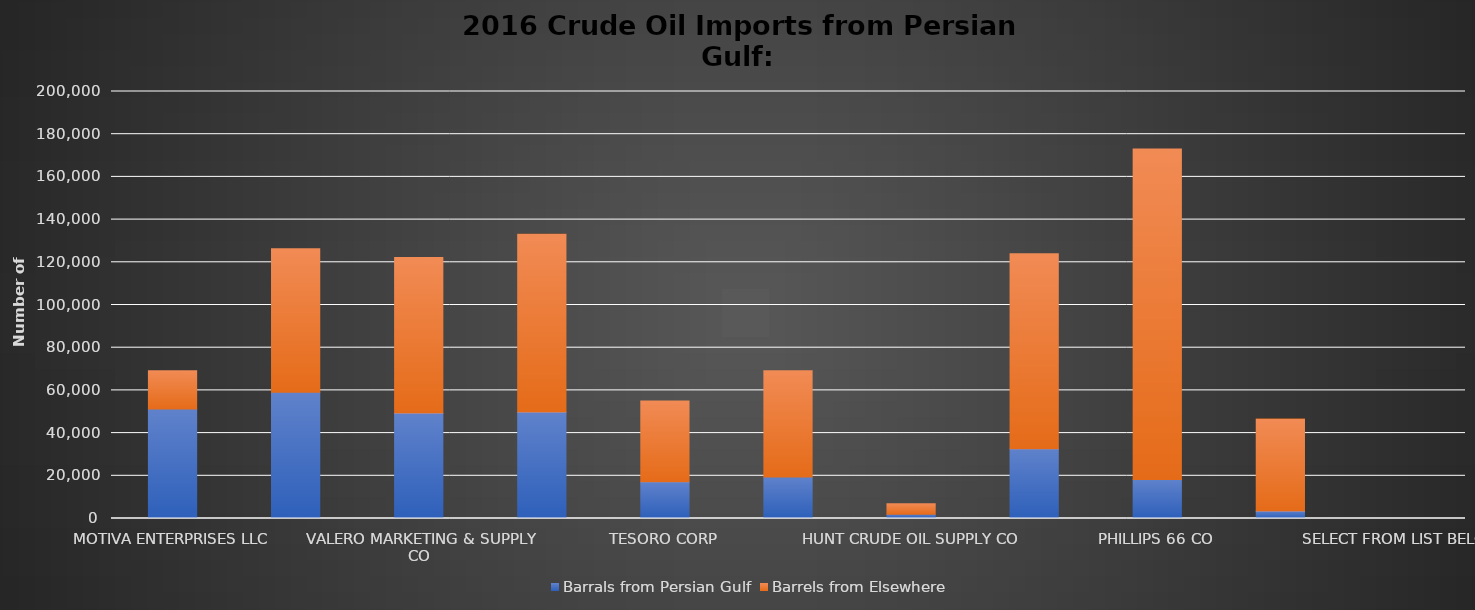
| Category | Barrals from Persian Gulf | Barrels from Elsewhere |
|---|---|---|
| MOTIVA ENTERPRISES LLC | 51274 | 17979 |
| MARATHON PETROLEUM CO LLC | 59079 | 67226 |
| VALERO MARKETING & SUPPLY CO | 49446 | 72754 |
| CHEVRON USA INC | 49919 | 83180 |
| TESORO CORP | 17176 | 37867 |
| PAULSBORO REFINING CO LLC | 19398 | 49823 |
| HUNT CRUDE OIL SUPPLY CO | 1971 | 4959 |
| EXXONMOBIL OIL CORP | 32659 | 91339 |
| PHILLIPS 66 CO | 18317 | 154779 |
| FLINT HILLS RESOURCES LP | 3562 | 43019 |
| SELECT FROM LIST BELOW | 0 | 0 |